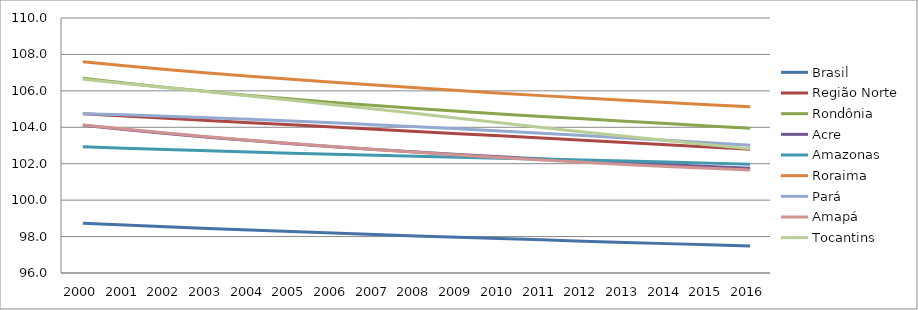
| Category | Brasil | Região Norte | Rondônia | Acre | Amazonas | Roraima | Pará | Amapá | Tocantins |
|---|---|---|---|---|---|---|---|---|---|
| 2000.0 | 98.729 | 104.744 | 106.694 | 104.107 | 102.938 | 107.601 | 104.749 | 104.125 | 106.638 |
| 2001.0 | 98.63 | 104.621 | 106.432 | 103.872 | 102.854 | 107.382 | 104.683 | 103.9 | 106.41 |
| 2002.0 | 98.535 | 104.498 | 106.189 | 103.658 | 102.777 | 107.175 | 104.608 | 103.686 | 106.179 |
| 2003.0 | 98.445 | 104.376 | 105.964 | 103.457 | 102.706 | 106.983 | 104.526 | 103.481 | 105.948 |
| 2004.0 | 98.358 | 104.255 | 105.751 | 103.273 | 102.64 | 106.806 | 104.438 | 103.29 | 105.714 |
| 2005.0 | 98.273 | 104.135 | 105.552 | 103.099 | 102.578 | 106.638 | 104.344 | 103.111 | 105.479 |
| 2006.0 | 98.192 | 104.014 | 105.366 | 102.936 | 102.52 | 106.478 | 104.245 | 102.941 | 105.24 |
| 2007.0 | 98.113 | 103.894 | 105.192 | 102.785 | 102.463 | 106.32 | 104.141 | 102.778 | 104.998 |
| 2008.0 | 98.037 | 103.773 | 105.028 | 102.642 | 102.408 | 106.168 | 104.032 | 102.625 | 104.751 |
| 2009.0 | 97.963 | 103.652 | 104.876 | 102.51 | 102.355 | 106.018 | 103.918 | 102.479 | 104.5 |
| 2010.0 | 97.89 | 103.53 | 104.733 | 102.383 | 102.304 | 105.874 | 103.799 | 102.337 | 104.245 |
| 2011.0 | 97.819 | 103.408 | 104.596 | 102.264 | 102.253 | 105.738 | 103.675 | 102.201 | 103.99 |
| 2012.0 | 97.749 | 103.286 | 104.462 | 102.151 | 102.202 | 105.608 | 103.548 | 102.076 | 103.742 |
| 2013.0 | 97.68 | 103.163 | 104.331 | 102.043 | 102.148 | 105.481 | 103.417 | 101.959 | 103.502 |
| 2014.0 | 97.613 | 103.04 | 104.201 | 101.94 | 102.092 | 105.361 | 103.284 | 101.852 | 103.269 |
| 2015.0 | 97.546 | 102.917 | 104.074 | 101.841 | 102.032 | 105.243 | 103.148 | 101.752 | 103.041 |
| 2016.0 | 97.481 | 102.794 | 103.949 | 101.747 | 101.972 | 105.13 | 103.009 | 101.659 | 102.82 |